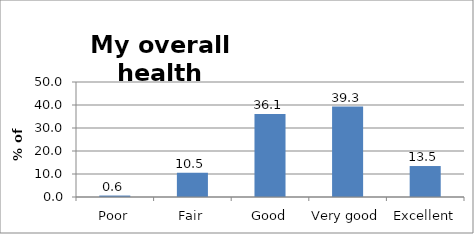
| Category | Series 0 |
|---|---|
| Poor | 0.63 |
| Fair | 10.546 |
| Good | 36.062 |
| Very good | 39.299 |
| Excellent | 13.463 |